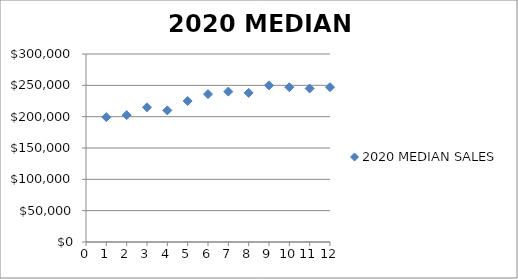
| Category | 2020 MEDIAN SALES |
|---|---|
| 1.0 | 199250 |
| 2.0 | 202500 |
| 3.0 | 215000 |
| 4.0 | 210000 |
| 5.0 | 225000 |
| 6.0 | 236000 |
| 7.0 | 240000 |
| 8.0 | 237975 |
| 9.0 | 250000 |
| 10.0 | 247000 |
| 11.0 | 245000 |
| 12.0 | 247000 |